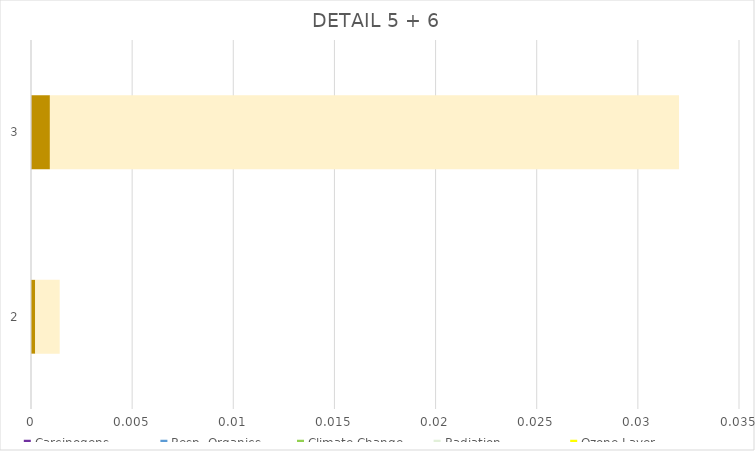
| Category | Carcinogens | Resp. Organics | Climate Change | Radiation | Ozone Layer | Ecotoxicity | Acid./Eutroph. | Land Use | Minerals | Fossile Fuels |
|---|---|---|---|---|---|---|---|---|---|---|
| 0 | 0 | 0 | 0 | 0 | 0 | 0 | 0 | 0 | 0 | 0.001 |
| 1 | 0 | 0 | 0 | 0 | 0 | 0 | 0 | 0 | 0.001 | 0.031 |